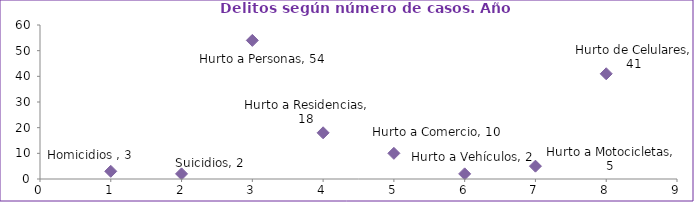
| Category | Series 0 |
|---|---|
| 0 | 3 |
| 1 | 2 |
| 2 | 54 |
| 3 | 18 |
| 4 | 10 |
| 5 | 2 |
| 6 | 5 |
| 7 | 41 |